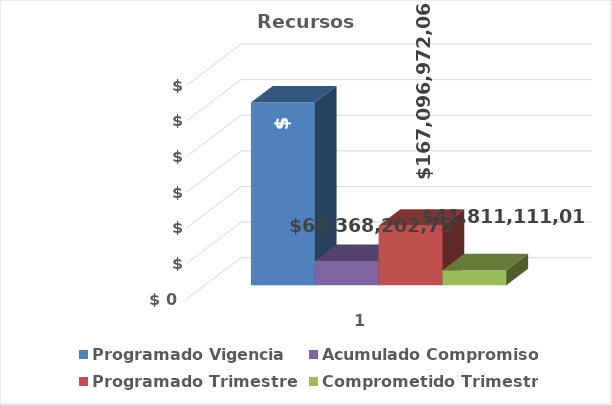
| Category | Programado Vigencia | Acumulado Compromisos | Programado Trimestre | Comprometido Trimestre |
|---|---|---|---|---|
| 0 | 512815800392 | 68368202756.59 | 167096972062.87 | 41811111019.46 |